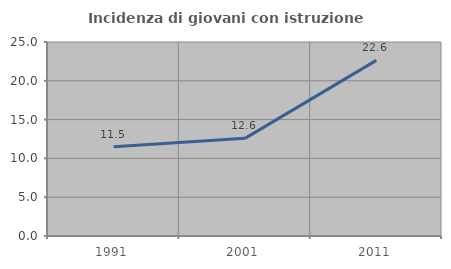
| Category | Incidenza di giovani con istruzione universitaria |
|---|---|
| 1991.0 | 11.486 |
| 2001.0 | 12.581 |
| 2011.0 | 22.632 |